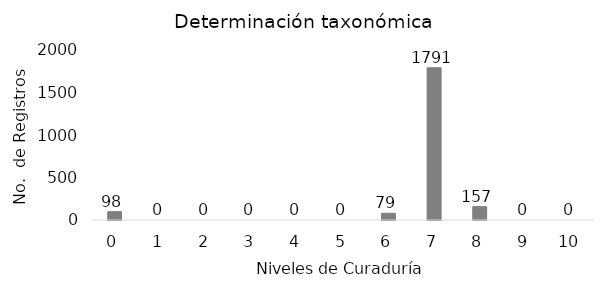
| Category | # de registros |
|---|---|
| 0.0 | 98 |
| 1.0 | 0 |
| 2.0 | 0 |
| 3.0 | 0 |
| 4.0 | 0 |
| 5.0 | 0 |
| 6.0 | 79 |
| 7.0 | 1791 |
| 8.0 | 157 |
| 9.0 | 0 |
| 10.0 | 0 |